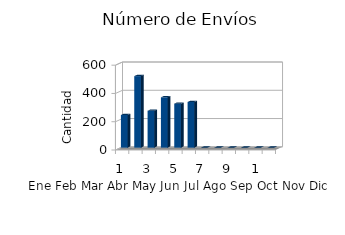
| Category | Series 0 |
|---|---|
| 0 | 231 |
| 1 | 506 |
| 2 | 261 |
| 3 | 356 |
| 4 | 311 |
| 5 | 323 |
| 6 | 0 |
| 7 | 0 |
| 8 | 0 |
| 9 | 0 |
| 10 | 0 |
| 11 | 0 |